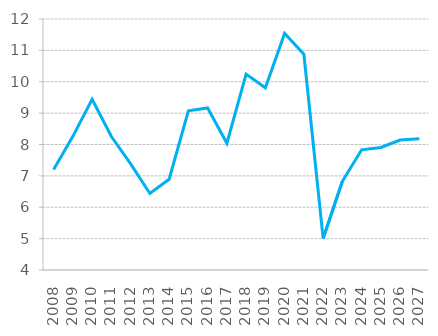
| Category | RRZ |
|---|---|
| 2008.0 | 7.203 |
| 2009.0 | 8.26 |
| 2010.0 | 9.44 |
| 2011.0 | 8.253 |
| 2012.0 | 7.381 |
| 2013.0 | 6.439 |
| 2014.0 | 6.893 |
| 2015.0 | 9.074 |
| 2016.0 | 9.166 |
| 2017.0 | 8.039 |
| 2018.0 | 10.244 |
| 2019.0 | 9.806 |
| 2020.0 | 11.539 |
| 2021.0 | 10.876 |
| 2022.0 | 5.007 |
| 2023.0 | 6.827 |
| 2024.0 | 7.831 |
| 2025.0 | 7.906 |
| 2026.0 | 8.142 |
| 2027.0 | 8.186 |